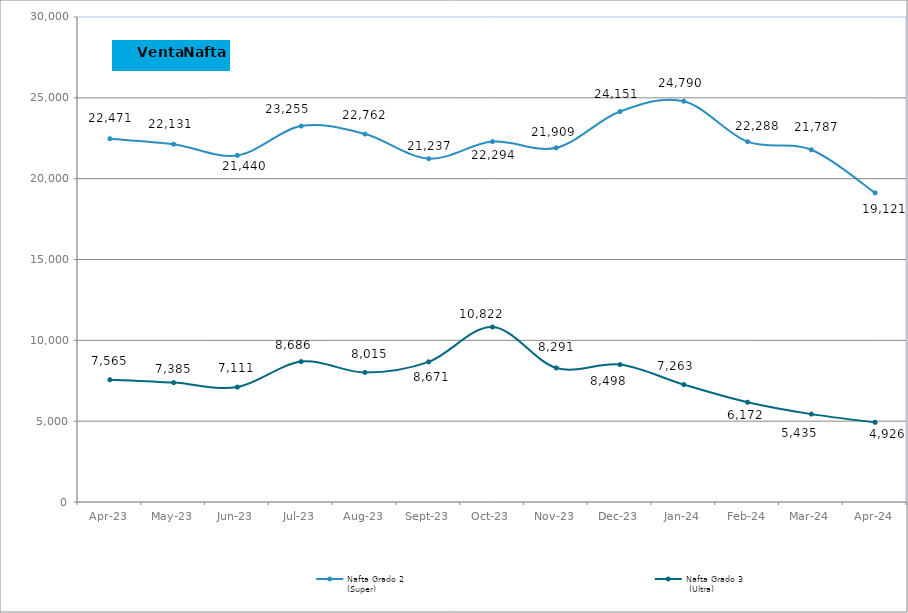
| Category | Nafta Grado 2
(Super) | Nafta Grado 3
 (Ultra)  |
|---|---|---|
| 2023-04-01 | 22471.07 | 7565.48 |
| 2023-05-01 | 22131.31 | 7384.99 |
| 2023-06-01 | 21440.4 | 7110.78 |
| 2023-07-01 | 23255.02 | 8686.26 |
| 2023-08-01 | 22761.83 | 8015.38 |
| 2023-09-01 | 21237.28 | 8671.08 |
| 2023-10-01 | 22293.87 | 10821.849 |
| 2023-11-01 | 21909.147 | 8291.063 |
| 2023-12-01 | 24151.455 | 8498.452 |
| 2024-01-01 | 24789.514 | 7262.821 |
| 2024-02-01 | 22287.557 | 6171.871 |
| 2024-03-01 | 21786.78 | 5435.26 |
| 2024-04-01 | 19120.75 | 4925.55 |